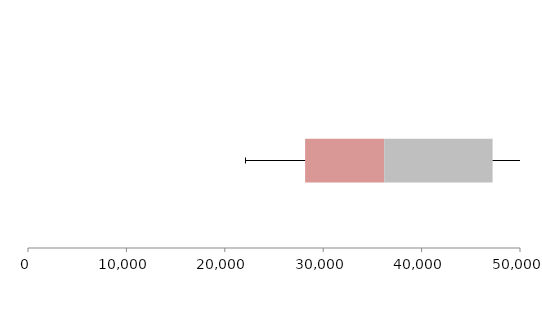
| Category | Series 1 | Series 2 | Series 3 |
|---|---|---|---|
| 0 | 28161.424 | 8040.475 | 11012.729 |